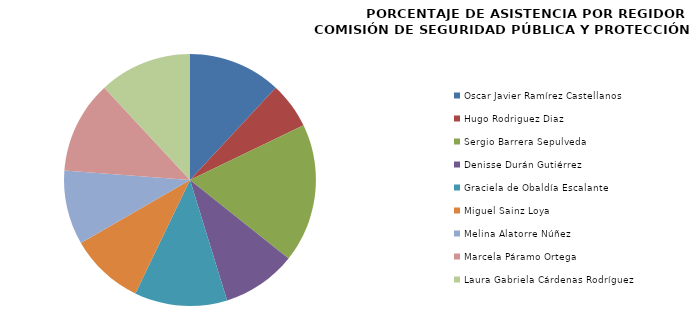
| Category | Series 0 |
|---|---|
| Oscar Javier Ramírez Castellanos | 100 |
| Hugo Rodriguez Diaz  | 50 |
| Sergio Barrera Sepulveda | 150 |
| Denisse Durán Gutiérrez | 80 |
| Graciela de Obaldía Escalante | 100 |
| Miguel Sainz Loya | 80 |
| Melina Alatorre Núñez | 80 |
| Marcela Páramo Ortega | 100 |
| Laura Gabriela Cárdenas Rodríguez | 100 |